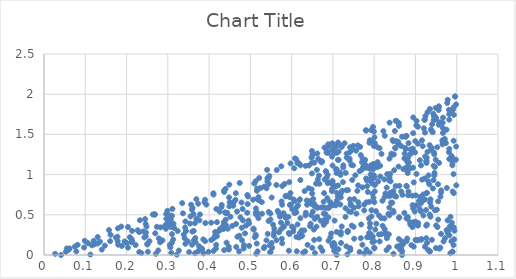
| Category | Series 0 |
|---|---|
| 0.3070497649272744 | 0.409 |
| 0.725001586988589 | 1.087 |
| 0.5095330383467418 | 0.89 |
| 0.7491788354854625 | 1.358 |
| 0.9134312972160937 | 1.115 |
| 0.9310733424665492 | 0.916 |
| 0.6560143534649919 | 0.45 |
| 0.7190368506950143 | 0.717 |
| 0.9845870090882262 | 1.794 |
| 0.6255931763452097 | 0.239 |
| 0.6673933461414293 | 0.885 |
| 0.3890036401825033 | 0.655 |
| 0.6200912360928926 | 0.272 |
| 0.9921547678688489 | 0.123 |
| 0.8346472091099474 | 0.512 |
| 0.5662466689041356 | 0.548 |
| 0.6800089196566471 | 0.939 |
| 0.5528158931915826 | 0.09 |
| 0.8005545108075353 | 0.083 |
| 0.9518390606133226 | 0.563 |
| 0.7310391127308724 | 1.021 |
| 0.6111034641791904 | 1.19 |
| 0.9665549706235409 | 1.517 |
| 0.5956875371962214 | 0.622 |
| 0.6062852824526372 | 1.079 |
| 0.8415611706544808 | 1.261 |
| 0.8945519705392241 | 1.515 |
| 0.4267641198110218 | 0.326 |
| 0.678710162588666 | 0.77 |
| 0.7971405302204978 | 1.592 |
| 0.7438169328280968 | 0.536 |
| 0.7958289857257108 | 0.16 |
| 0.6173149417500813 | 1.143 |
| 0.8205073022126326 | 0.363 |
| 0.6982154945142347 | 1.388 |
| 0.943731275735242 | 0.931 |
| 0.7514206920747312 | 0.203 |
| 0.6039256323105225 | 0.294 |
| 0.8733132752875881 | 1.202 |
| 0.6633946385659116 | 0.94 |
| 0.9458343813561789 | 0.99 |
| 0.981980027722871 | 1.32 |
| 0.8533211458474628 | 0.727 |
| 0.7405950172075721 | 1.173 |
| 0.5829296847471984 | 0.884 |
| 0.6902198188301324 | 1.36 |
| 0.43864776500231145 | 0.53 |
| 0.43399823352134453 | 0.36 |
| 0.6241159649386732 | 0.306 |
| 0.6545571291723801 | 0.187 |
| 0.6983613228331528 | 0.13 |
| 0.8832959654660278 | 1.392 |
| 0.611525012192023 | 0.225 |
| 0.13571287727071696 | 0.165 |
| 0.30266792394079706 | 0.41 |
| 0.9363169308590241 | 0.692 |
| 0.8253604861839422 | 0.322 |
| 0.6409233304557433 | 0.831 |
| 0.7568869017094755 | 0.515 |
| 0.10662095809560727 | 0.147 |
| 0.992743163282861 | 0.77 |
| 0.9931301258171383 | 1.19 |
| 0.34846575468630137 | 0.169 |
| 0.1790670955475796 | 0.331 |
| 0.8556414152163271 | 0.105 |
| 0.9709993220737866 | 1.444 |
| 0.3072089882992395 | 0.349 |
| 0.9062636739104442 | 0.399 |
| 0.7222603872724452 | 0.798 |
| 0.9656562011730757 | 1.418 |
| 0.8655307106309384 | 0.79 |
| 0.8074730255357258 | 1.341 |
| 0.7858386160837396 | 0.227 |
| 0.3594037193597853 | 0.291 |
| 0.3776632296586133 | 0.505 |
| 0.9959207697700022 | 1.971 |
| 0.78988442319407 | 0.395 |
| 0.9107584724568967 | 1.179 |
| 0.6314740144409878 | 0.795 |
| 0.36557644256676497 | 0.396 |
| 0.5391310085265107 | 0.83 |
| 0.5755772957528117 | 0.666 |
| 0.8409786779451738 | 0.751 |
| 0.7057101089736312 | 0.854 |
| 0.8957725753057325 | 0.104 |
| 0.46543575665788056 | 0.386 |
| 0.989730248386991 | 0.043 |
| 0.965290960607585 | 1.376 |
| 0.5487737346435798 | 0.037 |
| 0.7402337861110879 | 1.201 |
| 0.5126907212008031 | 0.917 |
| 0.548693879904094 | 0.516 |
| 0.7741254451103736 | 1.1 |
| 0.3100093330466176 | 0.487 |
| 0.24699361122562835 | 0.279 |
| 0.29650849273352414 | 0.45 |
| 0.8948487710447344 | 0.407 |
| 0.7695440100696784 | 1.055 |
| 0.7433957472606513 | 0.618 |
| 0.9781347852374314 | 1.93 |
| 0.27692937525773675 | 0.057 |
| 0.3516072007685348 | 0.036 |
| 0.8900635658901666 | 0.123 |
| 0.8870123314660103 | 1.254 |
| 0.8785750293446377 | 0.174 |
| 0.4464666959652887 | 0.075 |
| 0.8397347959015038 | 0.916 |
| 0.9923152577072112 | 1.007 |
| 0.9061492932446311 | 0.366 |
| 0.9176391766157836 | 0.675 |
| 0.8074626171882762 | 1.093 |
| 0.6818812745742746 | 0.509 |
| 0.6337155295521498 | 1.109 |
| 0.23068939185443207 | 0.037 |
| 0.06209417651011934 | 0.082 |
| 0.5421398710477777 | 0.263 |
| 0.8082098830293012 | 1.155 |
| 0.9818622013563563 | 1.683 |
| 0.853634641552173 | 1.417 |
| 0.7214339374995619 | 1.343 |
| 0.78450967329659 | 0.785 |
| 0.5167265458756984 | 0.51 |
| 0.8600161614069372 | 0.105 |
| 0.7412703577657648 | 1.34 |
| 0.46012452452821756 | 0.66 |
| 0.43064683294624195 | 0.623 |
| 0.8044018136353854 | 0.545 |
| 0.9116183611069647 | 0.723 |
| 0.20342612318622838 | 0.092 |
| 0.4453426356134302 | 0.327 |
| 0.7877848319401499 | 0.274 |
| 0.5478092964358868 | 0.035 |
| 0.8996667359406408 | 1.416 |
| 0.7140016761178428 | 1.183 |
| 0.9979890914602817 | 1.186 |
| 0.6824825290567326 | 0.586 |
| 0.86850145687342 | 0.748 |
| 0.9274148885111936 | 1.21 |
| 0.6975227495425713 | 0.795 |
| 0.944006350456552 | 1.676 |
| 0.7762515259167917 | 0.019 |
| 0.2820720543568918 | 0.344 |
| 0.6337535351821341 | 0.492 |
| 0.9176620868222245 | 1.354 |
| 0.36584395202771575 | 0.022 |
| 0.8114634545417975 | 0.492 |
| 0.5412411720118565 | 0.915 |
| 0.6343732497950182 | 0.525 |
| 0.6873508799585589 | 0.999 |
| 0.8822485434938588 | 0.743 |
| 0.1474351264697906 | 0.116 |
| 0.315630093372424 | 0.335 |
| 0.7123038722516409 | 0.864 |
| 0.4404072794042502 | 0.44 |
| 0.5343518096943621 | 0.101 |
| 0.6495603674491486 | 0.765 |
| 0.33486430272637635 | 0.645 |
| 0.7981341090183545 | 0.972 |
| 0.8371774463389196 | 0.965 |
| 0.6775901144304963 | 0.663 |
| 0.5175993737872184 | 0.045 |
| 0.6512491323387929 | 0.54 |
| 0.8299175707795055 | 0.06 |
| 0.710043146545647 | 1.271 |
| 0.9897242563779457 | 0.038 |
| 0.38594187893291443 | 0.194 |
| 0.8053441779748277 | 0.389 |
| 0.4791859597205306 | 0.339 |
| 0.6841721001446541 | 0.413 |
| 0.7305705724119709 | 0.581 |
| 0.8732145753486052 | 0.523 |
| 0.7591914279855669 | 0.797 |
| 0.5744632661897181 | 0.322 |
| 0.8364861815591774 | 0.928 |
| 0.9738363689347954 | 1.392 |
| 0.8014784947242716 | 1.392 |
| 0.7089910404151487 | 0.287 |
| 0.32673565995606424 | 0.055 |
| 0.3537195237173006 | 0.391 |
| 0.6591986756604169 | 0.887 |
| 0.8460528726784085 | 0.55 |
| 0.44107320615033635 | 0.52 |
| 0.9193184344584736 | 0.492 |
| 0.8707437364715171 | 1.069 |
| 0.8541740039427205 | 1.666 |
| 0.519592207020753 | 0.458 |
| 0.5566682200827316 | 0.24 |
| 0.8248725340165219 | 0.455 |
| 0.6442612674459924 | 0.666 |
| 0.9663743676370914 | 1.58 |
| 0.8131563737572906 | 1.328 |
| 0.9086770701369272 | 0.673 |
| 0.6737414424305784 | 1.166 |
| 0.9870578685874855 | 0.17 |
| 0.5762251297339357 | 0.203 |
| 0.3085302216763091 | 0.026 |
| 0.9350148484669121 | 1.817 |
| 0.7252218452352861 | 1.116 |
| 0.4926111791485709 | 0.746 |
| 0.5130382231637883 | 0.531 |
| 0.7031156600113537 | 0.626 |
| 0.5076005337312521 | 0.329 |
| 0.3073254132688651 | 0.445 |
| 0.7031933554121034 | 1.267 |
| 0.8605196432513519 | 0.462 |
| 0.7125670632050853 | 1.399 |
| 0.7730860412779741 | 1.084 |
| 0.6459760645618189 | 0.388 |
| 0.9501432474127963 | 1.684 |
| 0.49555676489249273 | 0.428 |
| 0.7759431120840116 | 0.554 |
| 0.6044769724878659 | 0.334 |
| 0.8707210346110781 | 0.144 |
| 0.39341630148825724 | 0.627 |
| 0.9394023815162362 | 1.333 |
| 0.6500678019869017 | 0.088 |
| 0.6662193815481648 | 0.987 |
| 0.7954354525864844 | 0.888 |
| 0.8001875021933152 | 0.091 |
| 0.43648516056484865 | 0.061 |
| 0.2080974184994489 | 0.222 |
| 0.28715412716086314 | 0.181 |
| 0.5169063142642852 | 0.7 |
| 0.8255285566318616 | 0.721 |
| 0.654950809192715 | 1.149 |
| 0.3830220496378086 | 0.071 |
| 0.513660331116821 | 0.504 |
| 0.7915177403923752 | 0.263 |
| 0.5932292349238428 | 0.274 |
| 0.9490582789036782 | 1.185 |
| 0.9703779198890298 | 1.419 |
| 0.9811489820432473 | 1.805 |
| 0.8940800965724275 | 1.086 |
| 0.7410816772122133 | 0.691 |
| 0.44389476562699065 | 0.524 |
| 0.563168642784023 | 0.871 |
| 0.8583096203257738 | 1.407 |
| 0.24839549315427553 | 0.353 |
| 0.607307296171147 | 0.52 |
| 0.6792812198083674 | 0.41 |
| 0.8944356611898674 | 0.581 |
| 0.6848948853155751 | 0.963 |
| 0.5971486208776629 | 0.771 |
| 0.7977416355814583 | 1.133 |
| 0.14000129887389684 | 0.067 |
| 0.3619513137721654 | 0.509 |
| 0.9038328223190082 | 0.182 |
| 0.9924914323459438 | 1.838 |
| 0.8812417211535885 | 1.019 |
| 0.6796126635236117 | 1.337 |
| 0.37348887464570024 | 0.638 |
| 0.5277226206881684 | 0.657 |
| 0.9846384153798308 | 0.022 |
| 0.7178415495514808 | 0.628 |
| 0.24321468462907098 | 0.219 |
| 0.5459098220298798 | 0.984 |
| 0.8649656136458619 | 1.357 |
| 0.2684368689385281 | 0.507 |
| 0.7926179891014925 | 1.553 |
| 0.7997597064905245 | 0.171 |
| 0.8916549134459049 | 1.274 |
| 0.3765789618417321 | 0.431 |
| 0.8174863163357039 | 0.259 |
| 0.17851804596823098 | 0.172 |
| 0.9131289246109907 | 0.542 |
| 0.5282757406226397 | 0.513 |
| 0.3904402406046611 | 0.172 |
| 0.6888226383423443 | 1.377 |
| 0.48443825081348607 | 0.123 |
| 0.49432674511029107 | 0.727 |
| 0.7281759730041156 | 1.39 |
| 0.9985854576981191 | 1.349 |
| 0.9501587909222121 | 0.368 |
| 0.4971247727553809 | 0.393 |
| 0.9399048610373488 | 0.189 |
| 0.1870845442723969 | 0.354 |
| 0.7516993207349669 | 0.695 |
| 0.07471523691367417 | 0.104 |
| 0.6081803070062485 | 1.202 |
| 0.5513222087239132 | 0.149 |
| 0.7782663913938279 | 1.182 |
| 0.5932625684387646 | 0.053 |
| 0.9317349719731297 | 0.99 |
| 0.6565293039670159 | 0.023 |
| 0.7334701545154308 | 1.21 |
| 0.8385680286158169 | 1.007 |
| 0.9810665913155583 | 1.278 |
| 0.6552627620350668 | 0.608 |
| 0.6279769730123543 | 0.029 |
| 0.7612224972614668 | 0.866 |
| 0.698924275602623 | 0.911 |
| 0.8177100780293282 | 1.257 |
| 0.8867996543909487 | 0.408 |
| 0.921799720850916 | 1.683 |
| 0.9268421565178121 | 1.172 |
| 0.7413868872311618 | 1.281 |
| 0.4365323676317515 | 0.784 |
| 0.5812769465792557 | 0.35 |
| 0.2505278589417363 | 0.13 |
| 0.661241877241859 | 1.059 |
| 0.8388816448476677 | 0.774 |
| 0.9203614082461797 | 1.576 |
| 0.6986162941856925 | 1.314 |
| 0.6416292740035725 | 1.113 |
| 0.7861349668586449 | 0.227 |
| 0.8923544783225515 | 0.738 |
| 0.46766926133473813 | 0.54 |
| 0.4107414788832621 | 0.05 |
| 0.9925410360336214 | 0.344 |
| 0.2122116386401961 | 0.158 |
| 0.5442299973674956 | 0.957 |
| 0.3096263596587321 | 0.151 |
| 0.5716026182515391 | 0.478 |
| 0.4657847036844907 | 0.101 |
| 0.9418035706467038 | 1.528 |
| 0.1574879257475836 | 0.309 |
| 0.17802882721612207 | 0.227 |
| 0.6644483318168732 | 1.195 |
| 0.8599933134984581 | 1.606 |
| 0.8356314541851044 | 0.257 |
| 0.9280168824392097 | 0.151 |
| 0.8418549850811203 | 1.241 |
| 0.3239351091241988 | 0.298 |
| 0.3665963557284427 | 0.211 |
| 0.6143253809863027 | 0.38 |
| 0.9667910684327236 | 1.709 |
| 0.7982750730119637 | 0.711 |
| 0.3367550488167914 | 0.518 |
| 0.6199737390652874 | 0.693 |
| 0.949876366397647 | 1.704 |
| 0.4290510872859222 | 0.318 |
| 0.7913499553603897 | 1.113 |
| 0.9681761594072074 | 0.168 |
| 0.9019762895886421 | 0.617 |
| 0.7041114982219525 | 0.126 |
| 0.9373660594039211 | 1.563 |
| 0.7356836833415428 | 0.287 |
| 0.7615528764102623 | 0.656 |
| 0.5804371358891192 | 0.52 |
| 0.9267241849711877 | 1.145 |
| 0.5469959723696123 | 0.121 |
| 0.7896728593029748 | 0.344 |
| 0.9429799012496026 | 1.758 |
| 0.33859586294147576 | 0.254 |
| 0.7703812183576753 | 1.154 |
| 0.8580853725829982 | 1.385 |
| 0.6366246476307456 | 0.678 |
| 0.8928039472037902 | 0.347 |
| 0.6699412892170898 | 0.094 |
| 0.9816674464014334 | 1.752 |
| 0.439964103154453 | 0.823 |
| 0.8246831108855038 | 0.94 |
| 0.12051685327315093 | 0.129 |
| 0.8781144684517885 | 0.861 |
| 0.8768605149604672 | 1.478 |
| 0.9033632202245732 | 0.383 |
| 0.36739811587055404 | 0.157 |
| 0.3901705208161291 | 0.687 |
| 0.8308706400639484 | 0.209 |
| 0.2994671878669791 | 0.375 |
| 0.992454734871364 | 1.421 |
| 0.9471373103534642 | 1.095 |
| 0.47421647291520874 | 0.896 |
| 0.6995217235724404 | 1.384 |
| 0.6726248086167748 | 1.152 |
| 0.8606935949202266 | 0.469 |
| 0.6776486975047178 | 0.375 |
| 0.5413111126879026 | 0.955 |
| 0.7675761425009512 | 1.243 |
| 0.9364889056767088 | 0.476 |
| 0.9881313343853437 | 0.401 |
| 0.8937137777623775 | 1.324 |
| 0.8304055992056605 | 0.838 |
| 0.6990065181024343 | 0.878 |
| 0.34190800950337613 | 0.343 |
| 0.5487220870473867 | 0.441 |
| 0.12963495869256822 | 0.142 |
| 0.6628708155487195 | 0.586 |
| 0.7388977765455828 | 0.543 |
| 0.9303876626348231 | 0.065 |
| 0.08159602737187704 | 0.127 |
| 0.31388862498647985 | 0.388 |
| 0.9402498000975565 | 1.626 |
| 0.875150943944139 | 1.331 |
| 0.7914797085272719 | 1.003 |
| 0.5132021331750773 | 0.238 |
| 0.6991877191006238 | 1.113 |
| 0.8590727046344897 | 1.1 |
| 0.6188526553851729 | 0.682 |
| 0.8316099419100547 | 1.007 |
| 0.9495843775804665 | 0.086 |
| 0.24646521148256897 | 0.234 |
| 0.6008654128723485 | 0.353 |
| 0.49698982937184694 | 0.113 |
| 0.5133990608654834 | 0.579 |
| 0.7757655699943474 | 0.627 |
| 0.9601276171374401 | 0.092 |
| 0.7719806847029101 | 1.199 |
| 0.7001553572594206 | 0.104 |
| 0.8788673920428992 | 0.853 |
| 0.9231379971484892 | 1.523 |
| 0.7189943853817429 | 0.763 |
| 0.4165484002879688 | 0.08 |
| 0.6768231470213847 | 0.591 |
| 0.6720970898857909 | 0.591 |
| 0.8675575935401352 | 0.167 |
| 0.9348785747484065 | 0.047 |
| 0.7933282326628723 | 0.557 |
| 0.9423806418783535 | 0.827 |
| 0.5108097627857124 | 0.221 |
| 0.982699187699538 | 0.352 |
| 0.3426619412534212 | 0.418 |
| 0.47336970254618466 | 0.24 |
| 0.41747541085990436 | 0.572 |
| 0.9937521636364455 | 0.194 |
| 0.789141706753479 | 0.029 |
| 0.2961238037677382 | 0.509 |
| 0.5946100158117283 | 0.259 |
| 0.922624756129206 | 1.681 |
| 0.2359442326170827 | 0.023 |
| 0.8764521478918671 | 1.319 |
| 0.5975784946286834 | 1.139 |
| 0.44985716019779487 | 0.656 |
| 0.5442417299525998 | 0.423 |
| 0.41068125907003306 | 0.751 |
| 0.9372366292941343 | 1.306 |
| 0.85951241266572 | 1.643 |
| 0.4146890582292871 | 0.245 |
| 0.20345784977721681 | 0.348 |
| 0.3563783223303482 | 0.625 |
| 0.4727474033132325 | 0.044 |
| 0.6605718800499712 | 0.599 |
| 0.9551914652165133 | 0.441 |
| 0.09712160957559753 | 0.094 |
| 0.4189734485907041 | 0.235 |
| 0.39096742170681026 | 0.397 |
| 0.8446385692407895 | 1.429 |
| 0.9849642205341154 | 0.475 |
| 0.8674714505608706 | 0 |
| 0.8256253722061272 | 1.483 |
| 0.6124797831134198 | 0.046 |
| 0.5772363357950984 | 0.858 |
| 0.244891612509311 | 0.447 |
| 0.12031065503933552 | 0.175 |
| 0.05510900847996336 | 0.081 |
| 0.9456472039020946 | 1.705 |
| 0.7795094397045936 | 1.55 |
| 0.5155012347652596 | 0.143 |
| 0.7183757079041168 | 0.996 |
| 0.7468490070845306 | 0.933 |
| 0.7790600458311793 | 1.12 |
| 0.9777660557118472 | 0.275 |
| 0.9143748587272387 | 0.199 |
| 0.17411357515317988 | 0.216 |
| 0.9003058401119824 | 0.414 |
| 0.9229392116612698 | 0.103 |
| 0.7057132587177265 | 0.853 |
| 0.3425288691485212 | 0.139 |
| 0.2502791102706574 | 0.138 |
| 0.595453582052378 | 0.72 |
| 0.732545252409776 | 0.806 |
| 0.9144219092161183 | 0.19 |
| 0.5549857522804281 | 0.377 |
| 0.6537486724540083 | 0.316 |
| 0.9619422701643466 | 0.262 |
| 0.79317741241004 | 0.215 |
| 0.8809434008009365 | 1.042 |
| 0.8369503052632805 | 0.73 |
| 0.902456166607094 | 1.008 |
| 0.6893959702471137 | 0.583 |
| 0.2307177405472762 | 0.285 |
| 0.6485371684399547 | 0.817 |
| 0.7543126261375096 | 0.992 |
| 0.2951607125352582 | 0.326 |
| 0.847739861589448 | 1.251 |
| 0.8989368329762788 | 1.276 |
| 0.9777123535177198 | 0.43 |
| 0.6446850746602227 | 0.358 |
| 0.7350763623416103 | 0.008 |
| 0.43867930526620896 | 0.338 |
| 0.9824659960355283 | 0.244 |
| 0.8007056545363473 | 1.464 |
| 0.8279771335249192 | 0.277 |
| 0.3757619199443229 | 0.109 |
| 0.8014446904957222 | 0.791 |
| 0.45617175074702193 | 0.362 |
| 0.81331987799695 | 0.168 |
| 0.9059961772141301 | 1.595 |
| 0.344031751723324 | 0.299 |
| 0.3053151127538024 | 0.491 |
| 0.5126795958436711 | 0.254 |
| 0.8756084747082992 | 1.47 |
| 0.744648592135408 | 1.12 |
| 0.7887188676929872 | 1.396 |
| 0.9383088489512913 | 0.601 |
| 0.7091507309594702 | 0.003 |
| 0.732582888978892 | 0.108 |
| 0.5573211379453478 | 0.281 |
| 0.8816397690790431 | 0.471 |
| 0.9622457044722357 | 0.803 |
| 0.7420164523976235 | 0.085 |
| 0.7040808696785379 | 0.428 |
| 0.4360093156678655 | 0.8 |
| 0.5833266937701979 | 0.484 |
| 0.8280002416645676 | 0.254 |
| 0.8616346203465525 | 0.115 |
| 0.5197593573450212 | 0.682 |
| 0.48938539301578654 | 0.366 |
| 0.7479398452227591 | 1.311 |
| 0.8408563172707741 | 0.651 |
| 0.6704083650626749 | 1.162 |
| 0.17967148517827275 | 0.128 |
| 0.3586756083704404 | 0.128 |
| 0.8467953196621795 | 0.016 |
| 0.7092170647344154 | 0.775 |
| 0.7809391527316456 | 1.085 |
| 0.22702246409016813 | 0.308 |
| 0.878135733768124 | 1.09 |
| 0.24072344838790652 | 0.294 |
| 0.6891531593615905 | 0.467 |
| 0.4053001605155314 | 0.186 |
| 0.9653808437158203 | 1.426 |
| 0.9533493071957123 | 0.348 |
| 0.8787291084195821 | 0.459 |
| 0.8872191029455483 | 1.08 |
| 0.5067888086763724 | 0.688 |
| 0.8171074769516504 | 0.459 |
| 0.5154600972876509 | 0.534 |
| 0.7622351328938417 | 0.605 |
| 0.822357895042134 | 1.541 |
| 0.6306338076109136 | 0.306 |
| 0.797291420894935 | 1.066 |
| 0.6999774231361305 | 1.299 |
| 0.9056389512118426 | 1.384 |
| 0.48111455167473427 | 0.572 |
| 0.8839799031685239 | 1.149 |
| 0.7087020235688607 | 1.068 |
| 0.9606791414571301 | 0.726 |
| 0.7206950679849105 | 1.362 |
| 0.9335558008098966 | 0.879 |
| 0.7932683126925271 | 0.48 |
| 0.8487162273105222 | 0.745 |
| 0.1952178742442458 | 0.169 |
| 0.42305164389826344 | 0.295 |
| 0.8799715377316335 | 0.205 |
| 0.6747425626374188 | 0.051 |
| 0.3549400187957028 | 0.479 |
| 0.9188074334749973 | 0.752 |
| 0.8737683795715944 | 1.262 |
| 0.7995291315211789 | 1.099 |
| 0.59819089040399 | 0.628 |
| 0.7486565110937732 | 1.115 |
| 0.9222393036742467 | 0.951 |
| 0.362793364823403 | 0.299 |
| 0.5198307537571468 | 0.72 |
| 0.05320483930085307 | 0.041 |
| 0.7360434160791984 | 0.301 |
| 0.9279063247731907 | 0.772 |
| 0.31292356226759865 | 0.192 |
| 0.5338141317439075 | 0.851 |
| 0.7809995222367154 | 1.548 |
| 0.44068070370962054 | 0.373 |
| 0.4796477433496006 | 0.184 |
| 0.924191721452505 | 1.728 |
| 0.6887445997096432 | 1.27 |
| 0.9347327290416345 | 0.503 |
| 0.2710174642589631 | 0.015 |
| 0.4104295187599538 | 0.768 |
| 0.9021391700562214 | 1.612 |
| 0.6940654416593975 | 0.221 |
| 0.6228104273356425 | 0.232 |
| 0.648148331984438 | 1.211 |
| 0.695870385024705 | 0.267 |
| 0.30615335893110446 | 0.096 |
| 0.686386080215699 | 0.707 |
| 0.8647442330872736 | 0.105 |
| 0.6890516558609951 | 0.903 |
| 0.661660782669213 | 0.476 |
| 0.6211656766421005 | 0.932 |
| 0.670354831658966 | 0.426 |
| 0.6601693045694557 | 0.353 |
| 0.6072476145324487 | 0.671 |
| 0.4483694269083889 | 0.716 |
| 0.9260831164304424 | 1.161 |
| 0.16128428629709657 | 0.251 |
| 0.09875062398718246 | 0.176 |
| 0.7872100829220974 | 0.454 |
| 0.5694274989821559 | 0.282 |
| 0.6374336366549006 | 0.625 |
| 0.8483559799254532 | 1.054 |
| 0.9262542335584818 | 0.365 |
| 0.20107833423683064 | 0.148 |
| 0.7853063375458583 | 0.937 |
| 0.5866292448613695 | 0.467 |
| 0.44755743295597694 | 0.105 |
| 0.8468561494116325 | 0.53 |
| 0.9580948339910056 | 0.079 |
| 0.18858827417619706 | 0.112 |
| 0.9563289801760365 | 1.62 |
| 0.6545227748484468 | 0.636 |
| 0.5915945932429715 | 0.731 |
| 0.9130431008849049 | 0.643 |
| 0.8272440237368952 | 0.765 |
| 0.8509901915472655 | 1.333 |
| 0.9528100135549326 | 1.34 |
| 0.7364644258202475 | 0.806 |
| 0.8520651218082411 | 1.669 |
| 0.8373783329583491 | 1.646 |
| 0.9564589968359494 | 1.836 |
| 0.5918398876730644 | 0.475 |
| 0.925535033350669 | 0.559 |
| 0.9549884684087869 | 0.667 |
| 0.8959001225288757 | 0.903 |
| 0.9291212269967069 | 1.283 |
| 0.6047105574022866 | 0.691 |
| 0.992038410745065 | 0.339 |
| 0.57710782493431 | 0.146 |
| 0.8649893710483968 | 0.083 |
| 0.24635951002805567 | 0.386 |
| 0.6522128684172595 | 0.698 |
| 0.49226430285137873 | 0.525 |
| 0.6492549703749 | 1.147 |
| 0.6328235172820899 | 0.044 |
| 0.9546434153464103 | 0.881 |
| 0.9989458230311457 | 0.867 |
| 0.2554691880620022 | 0.172 |
| 0.9343447027327002 | 1.366 |
| 0.9461804479714057 | 1.021 |
| 0.7649014802734695 | 1.045 |
| 0.5389514738176291 | 0.182 |
| 0.8629033963515117 | 0.068 |
| 0.4820912406775043 | 0.43 |
| 0.7031377252643132 | 0.053 |
| 0.971521417559598 | 0.208 |
| 0.2685814439553062 | 0.501 |
| 0.5741964503213256 | 0.402 |
| 0.9455437037023228 | 1.252 |
| 0.38233285565416464 | 0.08 |
| 0.742258834225133 | 0.061 |
| 0.9930111535988245 | 1.743 |
| 0.44804393460232356 | 0.067 |
| 0.5769571481296035 | 0.625 |
| 0.29129543653392026 | 0.353 |
| 0.3216515724319662 | 0.005 |
| 0.9000827580715247 | 0.187 |
| 0.21357374581045896 | 0.172 |
| 0.16028753467931955 | 0.172 |
| 0.8144938473200592 | 1.109 |
| 0.7168620429994639 | 1.026 |
| 0.9292474412265055 | 1.775 |
| 0.7138037493286347 | 1.287 |
| 0.3864616780751206 | 0.02 |
| 0.8200961314287953 | 0.675 |
| 0.7565179860046898 | 1.298 |
| 0.801602518984043 | 0.871 |
| 0.5144327599263651 | 0.016 |
| 0.9760605761201723 | 0.834 |
| 0.8465262882169731 | 0.795 |
| 0.8006507452781307 | 0.963 |
| 0.3736408222756495 | 0.047 |
| 0.05921165317578764 | 0.062 |
| 0.9445642212265678 | 1.276 |
| 0.7242998990824032 | 0.906 |
| 0.31016276369992346 | 0.26 |
| 0.6921289424538413 | 0.603 |
| 0.9026678495705355 | 1.668 |
| 0.041298199907328234 | 0 |
| 0.699964628074218 | 0.622 |
| 0.2735161316225332 | 0.35 |
| 0.5079223224031472 | 0.316 |
| 0.45178049467181775 | 0.476 |
| 0.49329026331430975 | 0.634 |
| 0.6155310885440202 | 0.617 |
| 0.5580378165668646 | 0.327 |
| 0.4489346122939361 | 0.875 |
| 0.23235906006645554 | 0.433 |
| 0.5852627287495962 | 0.464 |
| 0.7022405954872727 | 0.149 |
| 0.5444306044073334 | 0.884 |
| 0.8675138565372943 | 1.471 |
| 0.9567410316178081 | 1.85 |
| 0.9621603931609488 | 0.778 |
| 0.6668078437416584 | 0.197 |
| 0.9895119604183625 | 1.115 |
| 0.7811553986183797 | 0.068 |
| 0.8830487601240375 | 0.789 |
| 0.8795527237059435 | 1.166 |
| 0.6777573646260411 | 0.515 |
| 0.9752670300876688 | 1.559 |
| 0.4050325513122857 | 0.402 |
| 0.6139528377780646 | 1.144 |
| 0.6115025751462934 | 0.591 |
| 0.8095742859077341 | 0.913 |
| 0.6476676274688569 | 0.495 |
| 0.8464155086630273 | 1.414 |
| 0.7993926038957223 | 1.536 |
| 0.47594459826692487 | 0.469 |
| 0.9962962662016481 | 1.972 |
| 0.7930316757521724 | 0.95 |
| 0.8609885376524152 | 0.861 |
| 0.48373173848833373 | 0.081 |
| 0.8492587851273129 | 0.736 |
| 0.5633019446334663 | 0.184 |
| 0.9392307509570373 | 1.546 |
| 0.9908078499691989 | 1.806 |
| 0.5863445968945689 | 0.736 |
| 0.7196678043879676 | 0.15 |
| 0.621556019626994 | 1.115 |
| 0.42991954404784744 | 0.595 |
| 0.2988858707802562 | 0.55 |
| 0.8369137594391616 | 1.198 |
| 0.4640839078716306 | 0.687 |
| 0.13006018826754348 | 0.224 |
| 0.4686874493731787 | 0.227 |
| 0.5445561163816357 | 0.536 |
| 0.281249525793895 | 0.158 |
| 0.8877205229354117 | 0.378 |
| 0.6828041485744775 | 1.04 |
| 0.7332000217497001 | 1.261 |
| 0.5688837202988354 | 0.524 |
| 0.7068240158122057 | 0.617 |
| 0.6875474222514576 | 0.893 |
| 0.7511957415896927 | 0.588 |
| 0.7119298086522469 | 0.726 |
| 0.7824492801020568 | 0.927 |
| 0.5163077630196407 | 0.827 |
| 0.9983732641377586 | 1.873 |
| 0.6893510619303166 | 0.178 |
| 0.4422892025021476 | 0.154 |
| 0.9448971867211261 | 1.731 |
| 0.8518863024196022 | 0.857 |
| 0.7961562636961663 | 0.76 |
| 0.3048664842528853 | 0.123 |
| 0.7931092778248197 | 0.919 |
| 0.7992276766424344 | 1.356 |
| 0.9441922680687505 | 1.11 |
| 0.8501532120309421 | 1.543 |
| 0.7428245381275181 | 0.638 |
| 0.9158197554252545 | 1.426 |
| 0.8697458669456133 | 0.135 |
| 0.6848002449275001 | 1.306 |
| 0.9770402962635336 | 1.89 |
| 0.9754082861396925 | 0.309 |
| 0.8438886229719016 | 0.65 |
| 0.22192469010223823 | 0.124 |
| 0.295720507609843 | 0.379 |
| 0.7965973265268027 | 0.229 |
| 0.11243896340364848 | 0.005 |
| 0.5159108023082906 | 0.798 |
| 0.2695144723073746 | 0.27 |
| 0.7168303519129996 | 0.276 |
| 0.5406287842202794 | 1.059 |
| 0.39847061025969976 | 0.039 |
| 0.6386383332336261 | 0.127 |
| 0.21235291982712154 | 0.196 |
| 0.42552661909983314 | 0.54 |
| 0.7812355270102016 | 0.655 |
| 0.6803415281716774 | 0.441 |
| 0.6504465250588406 | 1.235 |
| 0.621200619170086 | 0.457 |
| 0.3009503797477101 | 0.436 |
| 0.6981578686268779 | 0.823 |
| 0.765980415565329 | 1.344 |
| 0.3691584498079992 | 0.695 |
| 0.7685294988536522 | 0.38 |
| 0.6508779614723212 | 1.253 |
| 0.8812954592736009 | 1.08 |
| 0.3112297082938004 | 0.573 |
| 0.7713098926289472 | 0.127 |
| 0.8880541062592932 | 1.313 |
| 0.9270544614107132 | 0.77 |
| 0.7907434713587846 | 0.92 |
| 0.8679392748203323 | 0.047 |
| 0.835579796963575 | 0.095 |
| 0.5639112772952256 | 1.057 |
| 0.966020803180188 | 1.645 |
| 0.7359035628186908 | 0.289 |
| 0.5515783235994433 | 0.715 |
| 0.5242015328441632 | 0.832 |
| 0.7501501112800085 | 0.351 |
| 0.5897016846571842 | 0.399 |
| 0.684630399467837 | 1.273 |
| 0.7134458652026882 | 0.071 |
| 0.900896589685425 | 0.741 |
| 0.027016539600694958 | 0.014 |
| 0.9277890348590243 | 0.378 |
| 0.8367236944451268 | 0.59 |
| 0.8982502439324683 | 0.541 |
| 0.7457658422984716 | 0.366 |
| 0.6491433659249486 | 1.015 |
| 0.6113389527496508 | 0.531 |
| 0.994479267588263 | 0.302 |
| 0.3601653336184035 | 0.586 |
| 0.8513083047137027 | 1.328 |
| 0.4586730733793466 | 0.612 |
| 0.8114774198859966 | 0.255 |
| 0.6176630409122467 | 0.217 |
| 0.5853134112937378 | 0.729 |
| 0.594310667646386 | 0.907 |
| 0.9807914772097713 | 0.308 |
| 0.6483570684543487 | 0.636 |
| 0.7885015180829936 | 0.661 |
| 0.7213705812342128 | 0.354 |
| 0.6492030135101624 | 1.294 |
| 0.7675389692981112 | 0.209 |
| 0.6622595292809624 | 1.262 |
| 0.9492723737204765 | 1.83 |
| 0.8025884812911613 | 0.317 |
| 0.4364112575806073 | 0.382 |
| 0.3633744953786038 | 0.185 |
| 0.9465918033061912 | 1.725 |
| 0.7077510872563054 | 1.063 |
| 0.859943341464943 | 0.198 |
| 0.8147402071848829 | 0.976 |
| 0.9099713000691203 | 0.575 |
| 0.07820481080327579 | 0.045 |
| 0.8816935168767515 | 1.207 |
| 0.6014726643744469 | 0.569 |
| 0.41176333102389123 | 0.211 |
| 0.34068276097342026 | 0.21 |
| 0.878597797024615 | 0.454 |
| 0.8829502386125451 | 1.146 |
| 0.987432925487502 | 1.231 |
| 0.7803049897823285 | 0.951 |
| 0.7305267614796657 | 0.474 |
| 0.26361132631516543 | 0.503 |
| 0.2516074609470412 | 0.04 |
| 0.7939621772428792 | 1.414 |
| 0.7941291382057167 | 0.982 |
| 0.36919741579447235 | 0.452 |
| 0.9347102044711363 | 0.042 |
| 0.9231785610612039 | 0.691 |
| 0.7716002022480581 | 0.841 |
| 0.7047147075892061 | 0.091 |
| 0.6406305078387782 | 0.642 |
| 0.782917862471862 | 0.22 |
| 0.8946952993217783 | 1.71 |
| 0.4190274131299725 | 0.408 |
| 0.5214321038764572 | 0.958 |
| 0.9887043705109385 | 1.188 |
| 0.9562060840861879 | 1.803 |
| 0.464771420494801 | 0.768 |
| 0.6978262145888693 | 1.223 |
| 0.760184006768457 | 1.363 |
| 0.4349170975034703 | 0.324 |
| 0.47852913101063405 | 0.653 |
| 0.7894109860132874 | 1.073 |
| 0.800361014240329 | 0.658 |
| 0.9819831049369514 | 1.194 |
| 0.21332725219669646 | 0.3 |
| 0.9235729225587033 | 1.225 |
| 0.8784697226569157 | 1.481 |
| 0.7120713983352546 | 1.183 |
| 0.8399922051250504 | 0.772 |
| 0.9067144342967811 | 0.185 |
| 0.7991189647592819 | 0.991 |
| 0.9161319677754957 | 0.938 |
| 0.9262010886898652 | 0.209 |
| 0.8369831485751424 | 0.494 |
| 0.9473673717599244 | 0.556 |
| 0.6830545908505821 | 1.041 |
| 0.8930921563754879 | 0.62 |
| 0.7192224333216377 | 0.285 |
| 0.3583604582073029 | 0.565 |
| 0.9598041823552677 | 1.65 |
| 0.709578179697453 | 0.676 |
| 0.5748941022025467 | 1.103 |
| 0.7075030974143771 | 1.346 |
| 0.7645509913977113 | 0.037 |
| 0.9572401729304344 | 1.146 |
| 0.11588380117475368 | 0.121 |
| 0.48709804110810023 | 0.269 |
| 0.8024750077198975 | 1.109 |
| 0.7895859472213886 | 1.427 |
| 0.41472677542882996 | 0.286 |
| 0.7090175198734366 | 1.019 |
| 0.4359878998805012 | 0.41 |
| 0.6988387777099976 | 0.92 |
| 0.9894399632456483 | 1.141 |
| 0.27833621436940076 | 0.207 |
| 0.7190710750243341 | 0.255 |
| 0.9354368147337151 | 0.653 |
| 0.4490588799474387 | 0.605 |
| 0.5327456207000008 | 0.086 |
| 0.4171104472853728 | 0.127 |
| 0.9902313908587216 | 0.79 |
| 0.782869035689629 | 0.856 |
| 0.6925423175629664 | 0.662 |